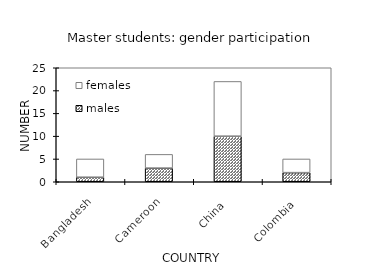
| Category | males | females |
|---|---|---|
| Bangladesh | 1 | 4 |
| Cameroon | 3 | 3 |
| China | 10 | 12 |
| Colombia | 2 | 3 |